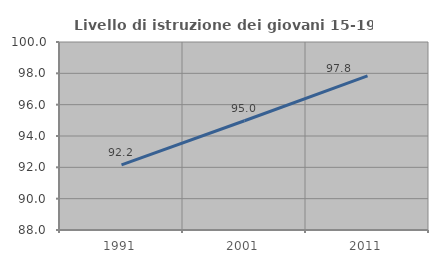
| Category | Livello di istruzione dei giovani 15-19 anni |
|---|---|
| 1991.0 | 92.157 |
| 2001.0 | 94.972 |
| 2011.0 | 97.842 |